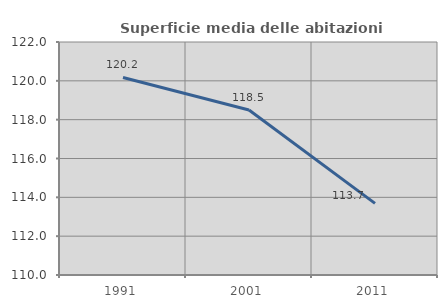
| Category | Superficie media delle abitazioni occupate |
|---|---|
| 1991.0 | 120.174 |
| 2001.0 | 118.502 |
| 2011.0 | 113.689 |